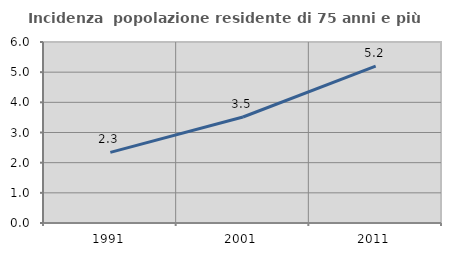
| Category | Incidenza  popolazione residente di 75 anni e più |
|---|---|
| 1991.0 | 2.34 |
| 2001.0 | 3.514 |
| 2011.0 | 5.201 |